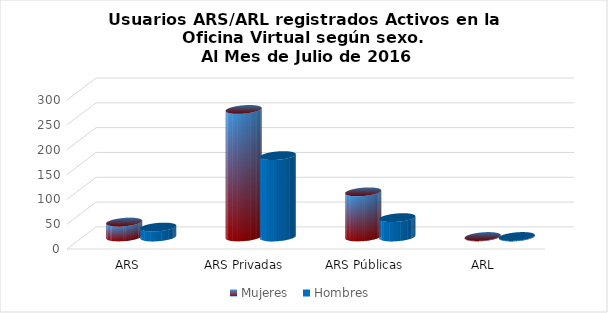
| Category | Mujeres | Hombres |
|---|---|---|
| ARS Autogestionadas | 30 | 20 |
| ARS Privadas | 257 | 164 |
| ARS Públicas | 91 | 39 |
| ARL | 1 | 1 |